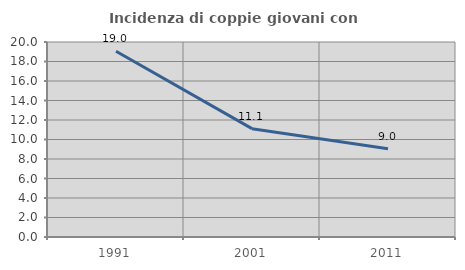
| Category | Incidenza di coppie giovani con figli |
|---|---|
| 1991.0 | 19.048 |
| 2001.0 | 11.111 |
| 2011.0 | 9.05 |